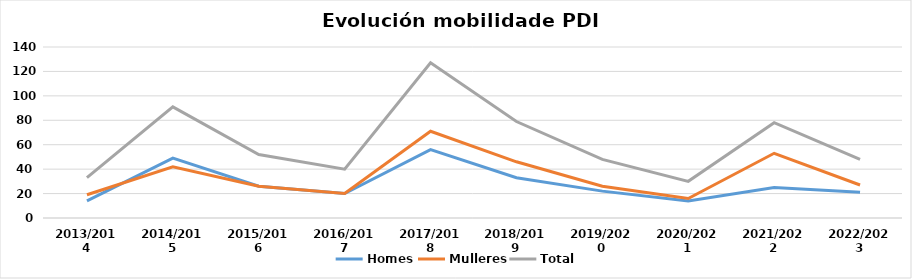
| Category | Homes | Mulleres | Total |
|---|---|---|---|
| 2013/2014 | 14 | 19 | 33 |
| 2014/2015 | 49 | 42 | 91 |
| 2015/2016 | 26 | 26 | 52 |
| 2016/2017 | 20 | 20 | 40 |
| 2017/2018 | 56 | 71 | 127 |
| 2018/2019 | 33 | 46 | 79 |
| 2019/2020 | 22 | 26 | 48 |
| 2020/2021 | 14 | 16 | 30 |
| 2021/2022 | 25 | 53 | 78 |
| 2022/2023 | 21 | 27 | 48 |